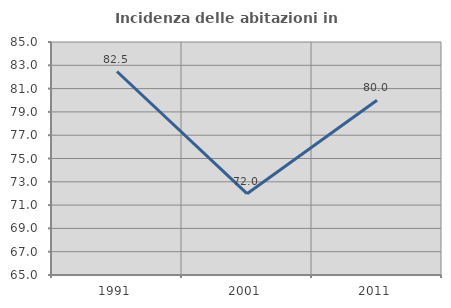
| Category | Incidenza delle abitazioni in proprietà  |
|---|---|
| 1991.0 | 82.468 |
| 2001.0 | 71.978 |
| 2011.0 | 80 |